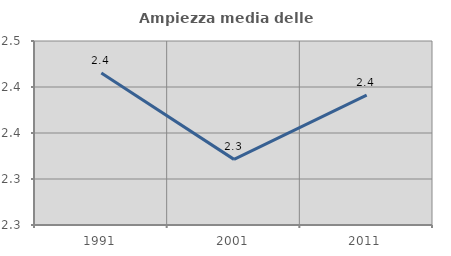
| Category | Ampiezza media delle famiglie |
|---|---|
| 1991.0 | 2.415 |
| 2001.0 | 2.321 |
| 2011.0 | 2.391 |